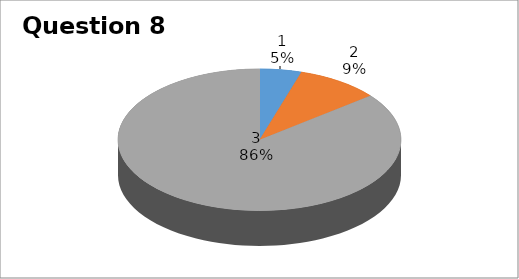
| Category | Series 0 |
|---|---|
| 0 | 1 |
| 1 | 2 |
| 2 | 18 |